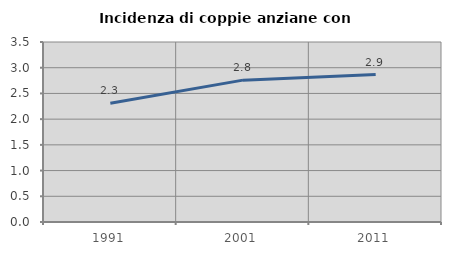
| Category | Incidenza di coppie anziane con figli |
|---|---|
| 1991.0 | 2.31 |
| 2001.0 | 2.759 |
| 2011.0 | 2.867 |